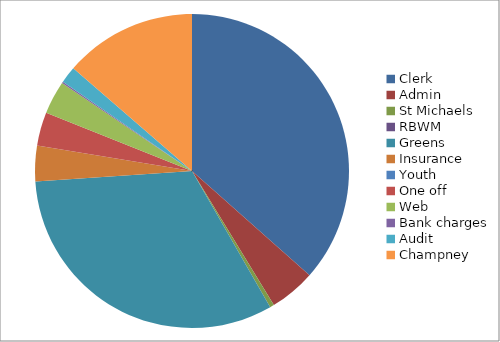
| Category | Series 0 |
|---|---|
| Clerk | 17000 |
| Admin | 2200 |
| St Michaels | 200 |
| RBWM | 0 |
| Greens | 15000 |
| Insurance | 1700 |
| Youth | 0 |
| One off | 1600 |
| Web | 1600 |
| Bank charges | 72 |
| Audit | 800 |
| Champney | 6350 |